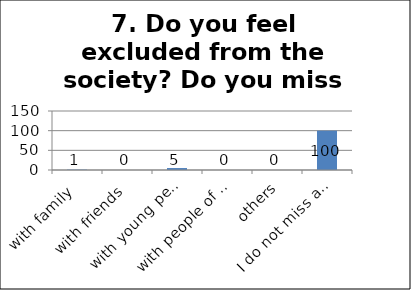
| Category | Series 0 |
|---|---|
| with family | 1 |
| with friends | 0 |
| with young peope | 5 |
| with people of similar interests | 0 |
| others | 0 |
| I do not miss anything | 100 |